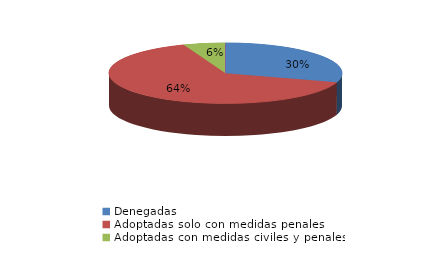
| Category | Series 0 |
|---|---|
| Denegadas | 67 |
| Adoptadas solo con medidas penales | 144 |
| Adoptadas con medidas civiles y penales | 13 |
| Adoptadas con medidas civiles | 0 |